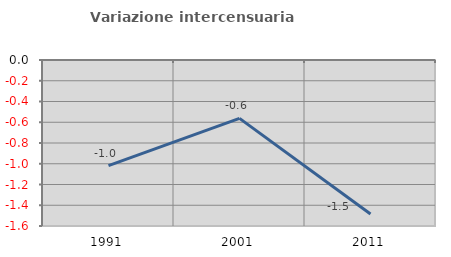
| Category | Variazione intercensuaria annua |
|---|---|
| 1991.0 | -1.018 |
| 2001.0 | -0.563 |
| 2011.0 | -1.484 |